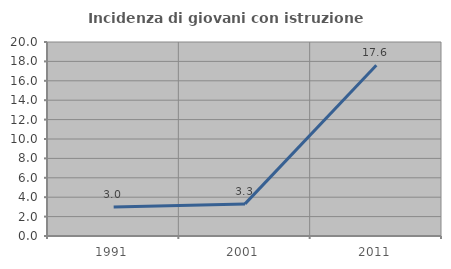
| Category | Incidenza di giovani con istruzione universitaria |
|---|---|
| 1991.0 | 2.994 |
| 2001.0 | 3.311 |
| 2011.0 | 17.6 |